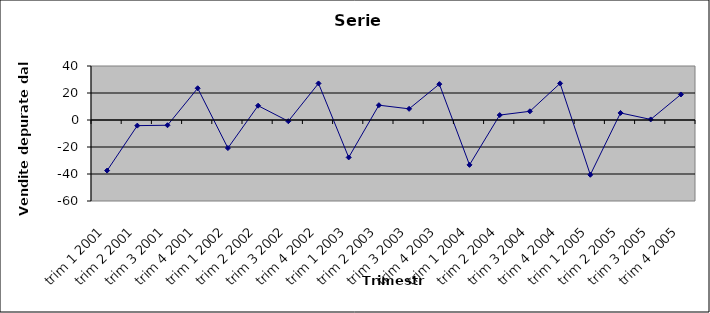
| Category | Serie detrendizzata |
|---|---|
| trim 1 2001 | -37.471 |
| trim 2 2001 | -4.177 |
| trim 3 2001 | -3.883 |
| trim 4 2001 | 23.511 |
| trim 1 2002 | -20.796 |
| trim 2 2002 | 10.598 |
| trim 3 2002 | -0.908 |
| trim 4 2002 | 27.086 |
| trim 1 2003 | -27.721 |
| trim 2 2003 | 10.973 |
| trim 3 2003 | 8.267 |
| trim 4 2003 | 26.561 |
| trim 1 2004 | -33.246 |
| trim 2 2004 | 3.648 |
| trim 3 2004 | 6.442 |
| trim 4 2004 | 27.136 |
| trim 1 2005 | -40.571 |
| trim 2 2005 | 5.223 |
| trim 3 2005 | 0.417 |
| trim 4 2005 | 18.911 |